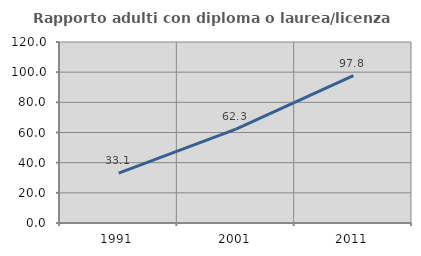
| Category | Rapporto adulti con diploma o laurea/licenza media  |
|---|---|
| 1991.0 | 33.129 |
| 2001.0 | 62.29 |
| 2011.0 | 97.759 |